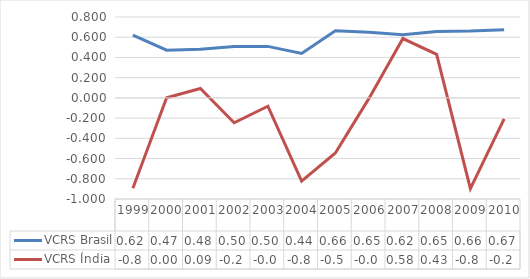
| Category | VCRS Brasil | VCRS Índia |
|---|---|---|
| 1999.0 | 0.62 | -0.895 |
| 2000.0 | 0.472 | 0.002 |
| 2001.0 | 0.481 | 0.093 |
| 2002.0 | 0.507 | -0.246 |
| 2003.0 | 0.509 | -0.083 |
| 2004.0 | 0.44 | -0.822 |
| 2005.0 | 0.664 | -0.544 |
| 2006.0 | 0.65 | -0.002 |
| 2007.0 | 0.624 | 0.587 |
| 2008.0 | 0.658 | 0.43 |
| 2009.0 | 0.661 | -0.897 |
| 2010.0 | 0.675 | -0.208 |